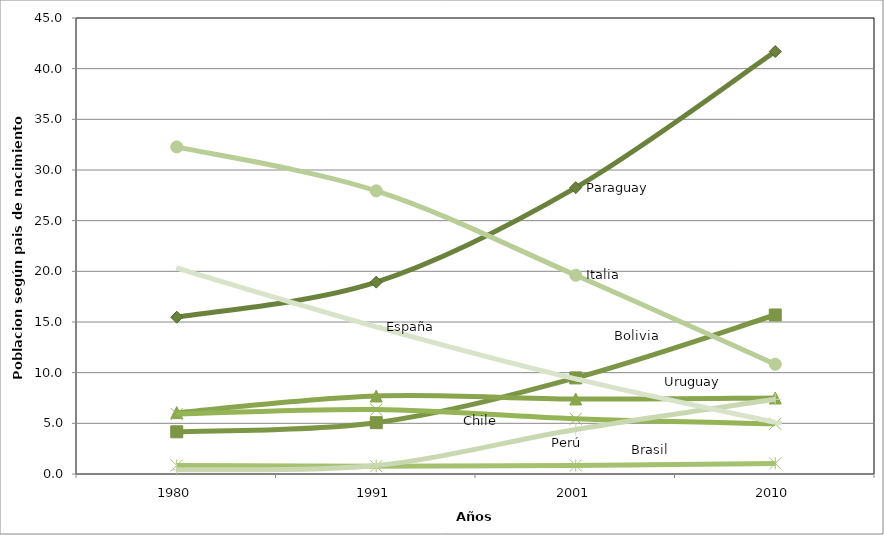
| Category | Paraguay | Bolivia | Uruguay | Chile | Brasil | Italia | Perú | España |
|---|---|---|---|---|---|---|---|---|
| 1980.0 | 15.473 | 4.164 | 6.058 | 5.911 | 0.838 | 32.277 | 0.42 | 20.311 |
| 1991.0 | 18.934 | 5.066 | 7.699 | 6.36 | 0.772 | 27.943 | 0.833 | 14.523 |
| 2001.0 | 28.262 | 9.483 | 7.4 | 5.446 | 0.836 | 19.613 | 4.391 | 9.383 |
| 2010.0 | 41.69 | 15.691 | 7.503 | 4.955 | 1.047 | 10.833 | 7.367 | 5.097 |